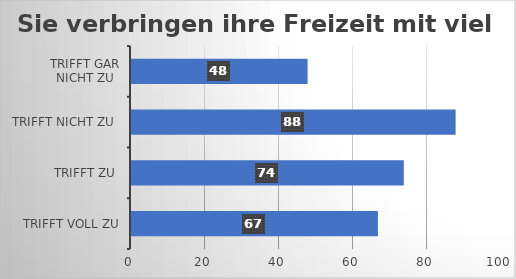
| Category | Sie verbringen ihre Freizeit mit viel Sport  |
|---|---|
| trifft voll zu | 67 |
| trifft zu  | 74 |
| trifft nicht zu  | 88 |
| trifft gar nicht zu | 48 |